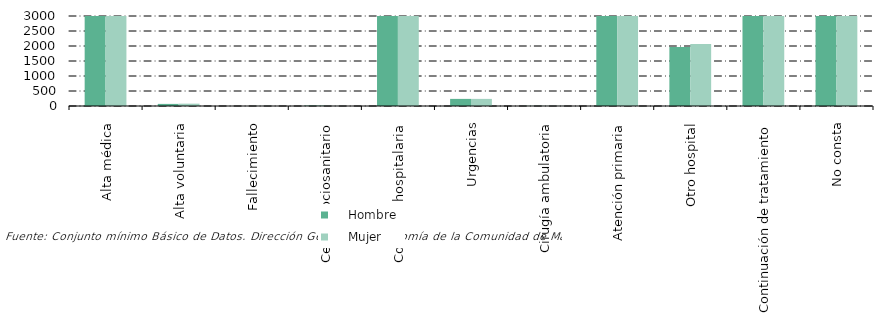
| Category |     Hombre |     Mujer |
|---|---|---|
| Alta médica | 394174 | 481833 |
| Alta voluntaria | 70 | 78 |
| Fallecimiento | 1 | 4 |
| Centro sociosanitario | 14 | 4 |
| Consulta hospitalaria | 62807 | 69890 |
| Urgencias | 237 | 237 |
| Cirugía ambulatoria | 5 | 6 |
| Atención primaria | 10885 | 12392 |
| Otro hospital | 1969 | 2063 |
| Continuación de tratamiento | 69117 | 83718 |
| No consta | 5533 | 15061 |